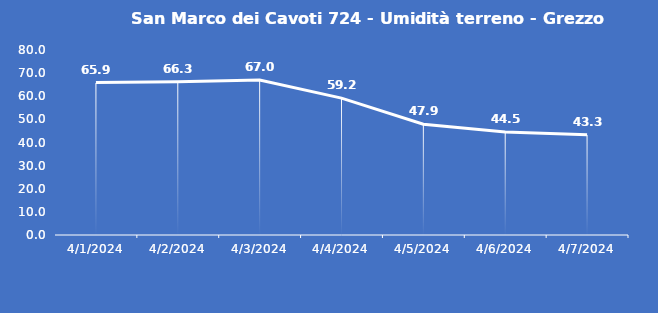
| Category | San Marco dei Cavoti 724 - Umidità terreno - Grezzo (%VWC) |
|---|---|
| 4/1/24 | 65.9 |
| 4/2/24 | 66.3 |
| 4/3/24 | 67 |
| 4/4/24 | 59.2 |
| 4/5/24 | 47.9 |
| 4/6/24 | 44.5 |
| 4/7/24 | 43.3 |